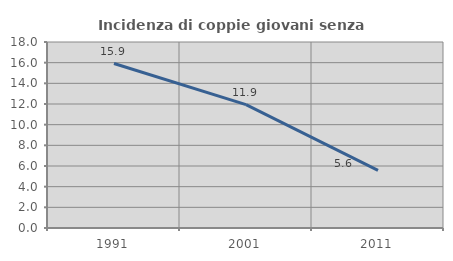
| Category | Incidenza di coppie giovani senza figli |
|---|---|
| 1991.0 | 15.918 |
| 2001.0 | 11.939 |
| 2011.0 | 5.581 |